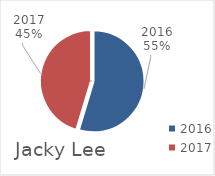
| Category | Jacky Lee |
|---|---|
| 2016 | 3267563 |
| 2017 | 2711156 |